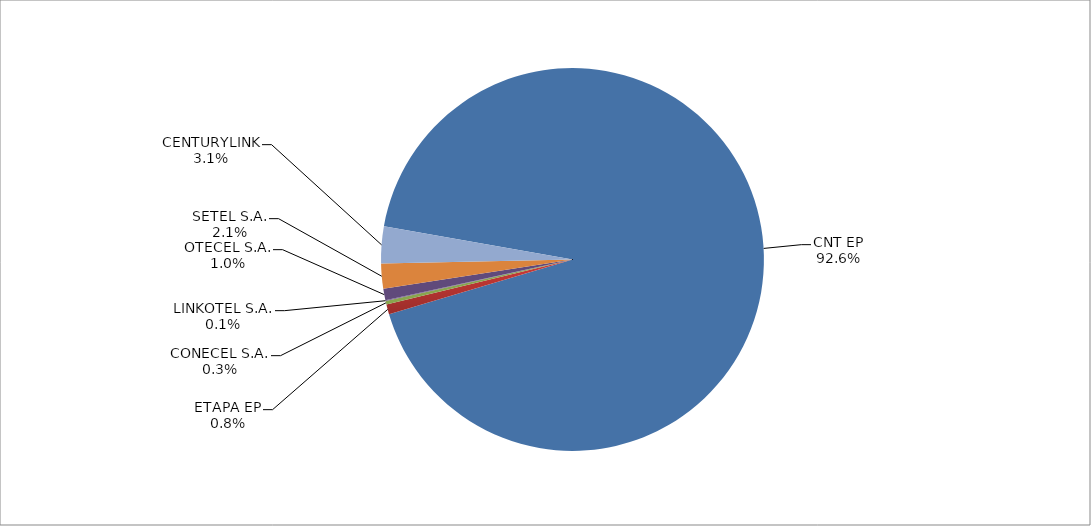
| Category | Series 0 |
|---|---|
| CNT EP | 2853 |
| ETAPA EP | 26 |
| CONECEL S.A. | 9 |
| LINKOTEL S.A. | 2 |
| OTECEL S.A. | 30 |
| SETEL S.A. | 65 |
| CENTURYLINK | 96 |